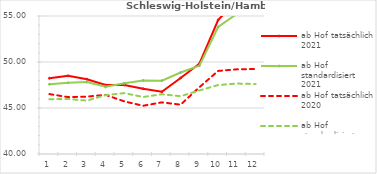
| Category | ab Hof tatsächlich 2021 | ab Hof standardisiert 2021 | ab Hof tatsächlich 2020 | ab Hof standardisiert 2020 |
|---|---|---|---|---|
| 0 | 48.227 | 47.575 | 46.514 | 45.958 |
| 1 | 48.494 | 47.737 | 46.185 | 45.974 |
| 2 | 48.133 | 47.819 | 46.237 | 45.807 |
| 3 | 47.498 | 47.301 | 46.429 | 46.399 |
| 4 | 47.506 | 47.686 | 45.714 | 46.617 |
| 5 | 47.097 | 47.998 | 45.244 | 46.196 |
| 6 | 46.759 | 47.97 | 45.614 | 46.497 |
| 7 | 48.265 | 48.862 | 45.363 | 46.282 |
| 8 | 49.817 | 49.592 | 47.257 | 46.909 |
| 9 | 54.564 | 53.8 | 49.03 | 47.495 |
| 10 | 56.705 | 55.24 | 49.205 | 47.658 |
| 11 | 57.459 | 55.757 | 49.239 | 47.603 |